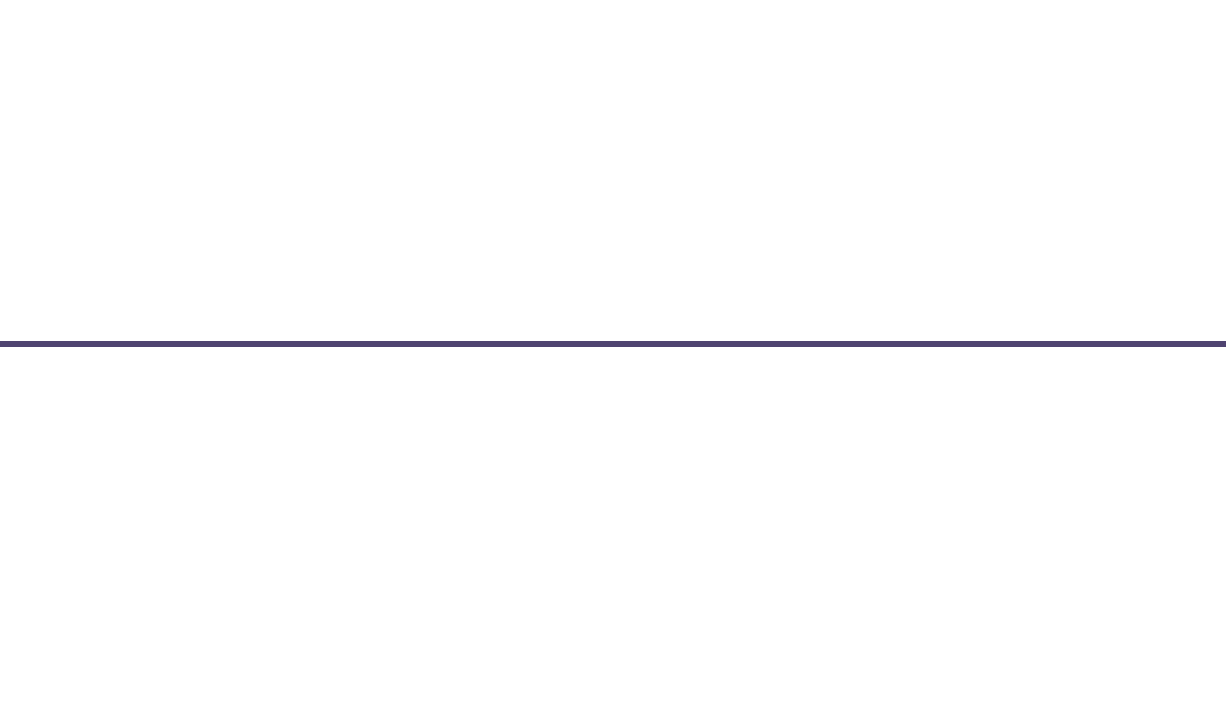
| Category | Θέση |
|---|---|
| 0 | 1 |
| 1 | -2 |
| 2 | 1 |
| 3 | -1 |
| 4 | -0.5 |
| 5 | 2 |
| 6 | 0.5 |
| 7 | -1 |
| 8 | 0.5 |
| 9 | -2 |